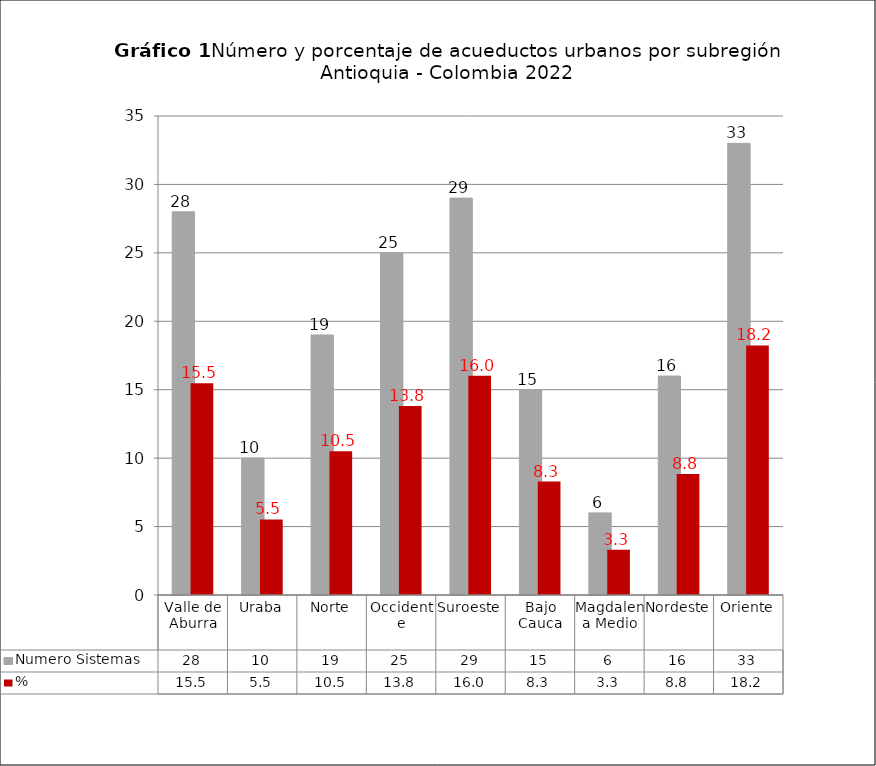
| Category | Numero Sistemas | % |
|---|---|---|
| 0 | 28 | 15.47 |
| 1 | 10 | 5.525 |
| 2 | 19 | 10.497 |
| 3 | 25 | 13.812 |
| 4 | 29 | 16.022 |
| 5 | 15 | 8.287 |
| 6 | 6 | 3.315 |
| 7 | 16 | 8.84 |
| 8 | 33 | 18.232 |